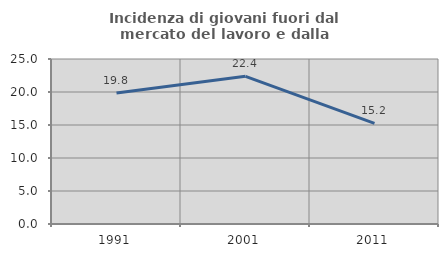
| Category | Incidenza di giovani fuori dal mercato del lavoro e dalla formazione  |
|---|---|
| 1991.0 | 19.849 |
| 2001.0 | 22.377 |
| 2011.0 | 15.247 |